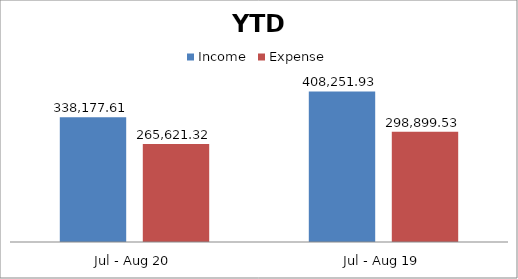
| Category | Income | Expense |
|---|---|---|
| Jul - Aug 20 | 338177.61 | 265621.32 |
| Jul - Aug 19 | 408251.93 | 298899.53 |